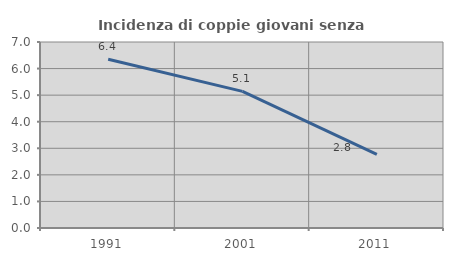
| Category | Incidenza di coppie giovani senza figli |
|---|---|
| 1991.0 | 6.354 |
| 2001.0 | 5.141 |
| 2011.0 | 2.77 |